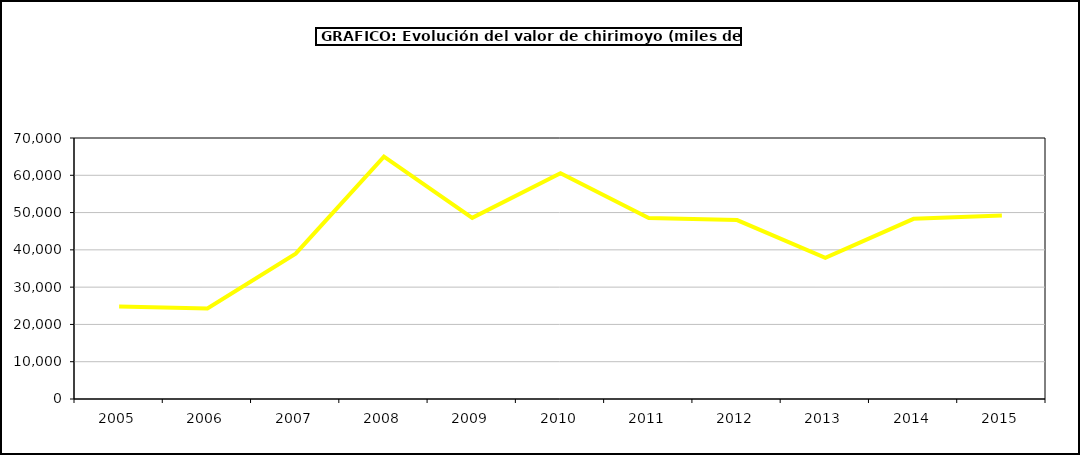
| Category | valor chirimoyo |
|---|---|
| 2005.0 | 24808.355 |
| 2006.0 | 24256.192 |
| 2007.0 | 38969.891 |
| 2008.0 | 65026.967 |
| 2009.0 | 48581.198 |
| 2010.0 | 60575.574 |
| 2011.0 | 48545.2 |
| 2012.0 | 47992.004 |
| 2013.0 | 37891.803 |
| 2014.0 | 48319.818 |
| 2015.0 | 49187 |